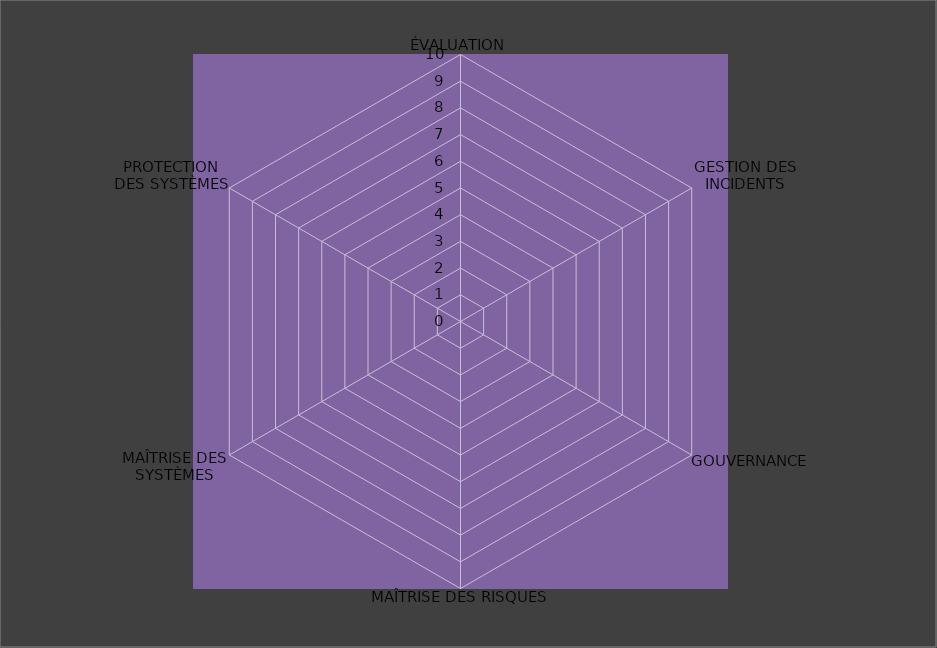
| Category | Année 2024 |
|---|---|
| ÉVALUATION | 0 |
| GESTION DES INCIDENTS | 0 |
| GOUVERNANCE | 0 |
| MAÎTRISE DES RISQUES | 0 |
| MAÎTRISE DES SYSTÈMES | 0 |
| PROTECTION
DES SYSTÈMES | 0 |